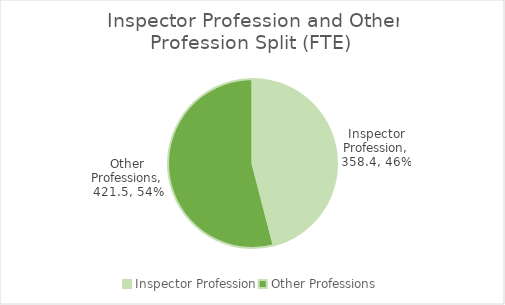
| Category | FTE |
|---|---|
| Inspector Profession | 358.4 |
| Other Professions | 421.5 |